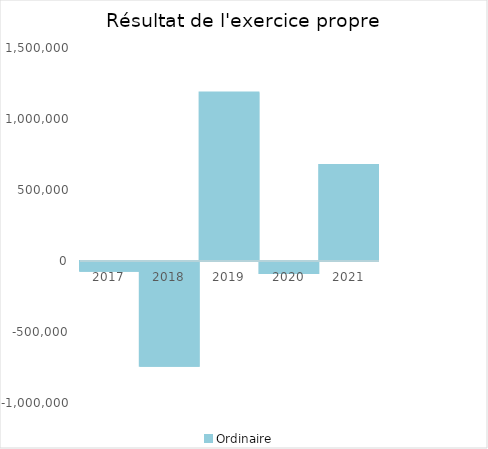
| Category |   | Ordinaire |    |
|---|---|---|---|
| 2017.0 |  | -68753.52 |  |
| 2018.0 |  | -737869.46 |  |
| 2019.0 |  | 1186390.41 |  |
| 2020.0 |  | -85107.44 |  |
| 2021.0 |  | 675242.88 |  |